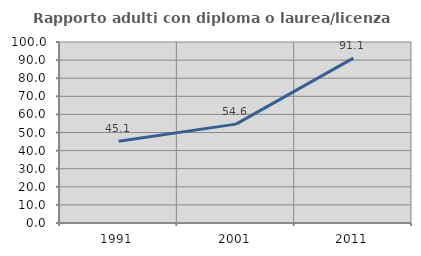
| Category | Rapporto adulti con diploma o laurea/licenza media  |
|---|---|
| 1991.0 | 45.133 |
| 2001.0 | 54.624 |
| 2011.0 | 91.081 |